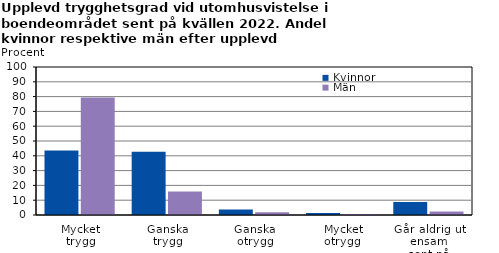
| Category | Kvinnor | Män |
|---|---|---|
| Mycket
trygg | 43.5 | 79.4 |
| Ganska
trygg | 42.8 | 15.8 |
| Ganska
otrygg | 3.7 | 1.8 |
|  Mycket
otrygg | 1.3 | 0.6 |
| Går aldrig ut ensam
sent på kvällarna | 8.7 | 2.3 |